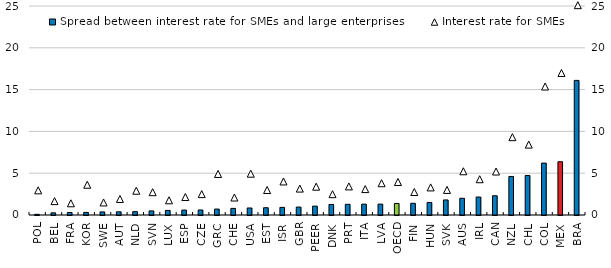
| Category | Spread between interest rate for SMEs and large enterprises |
|---|---|
| POL | 0.08 |
| BEL | 0.26 |
| FRA | 0.3 |
| KOR | 0.31 |
| SWE | 0.37 |
| AUT | 0.38 |
| NLD | 0.4 |
| SVN | 0.49 |
| LUX | 0.55 |
| ESP | 0.59 |
| CZE | 0.6 |
| GRC | 0.71 |
| CHE | 0.79 |
| USA | 0.84 |
| EST | 0.87 |
| ISR | 0.91 |
| GBR | 0.95 |
| PEER | 1.062 |
| DNK | 1.26 |
| PRT | 1.28 |
| ITA | 1.3 |
| LVA | 1.3 |
| OECD | 1.385 |
| FIN | 1.4 |
| HUN | 1.5 |
| SVK | 1.8 |
| AUS | 2 |
| IRL | 2.15 |
| CAN | 2.3 |
| NZL | 4.61 |
| CHL | 4.73 |
| COL | 6.21 |
| MEX | 6.37 |
| BRA | 16.1 |